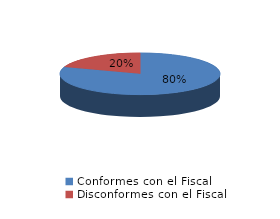
| Category | Series 0 |
|---|---|
| 0 | 86 |
| 1 | 21 |